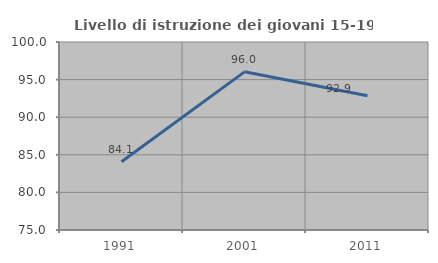
| Category | Livello di istruzione dei giovani 15-19 anni |
|---|---|
| 1991.0 | 84.08 |
| 2001.0 | 96.032 |
| 2011.0 | 92.857 |